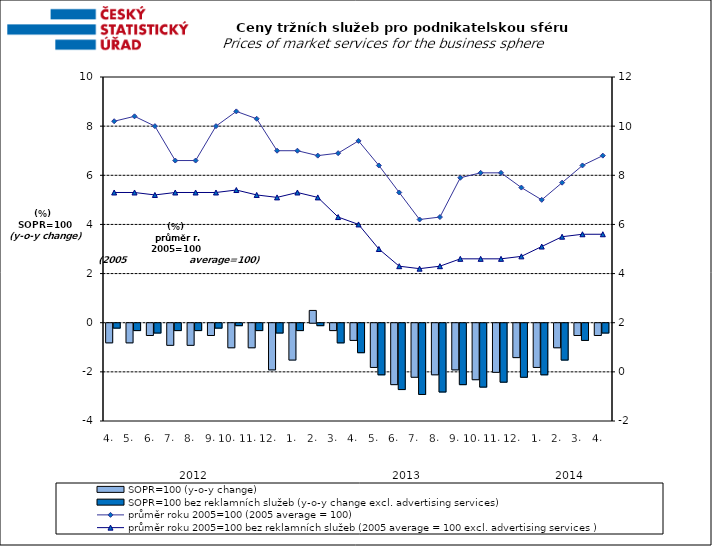
| Category | SOPR=100 (y-o-y change)   | SOPR=100 bez reklamních služeb (y-o-y change excl. advertising services)   |
|---|---|---|
| 0 | -0.8 | -0.2 |
| 1 | -0.8 | -0.3 |
| 2 | -0.5 | -0.4 |
| 3 | -0.9 | -0.3 |
| 4 | -0.9 | -0.3 |
| 5 | -0.5 | -0.2 |
| 6 | -1 | -0.1 |
| 7 | -1 | -0.3 |
| 8 | -1.9 | -0.4 |
| 9 | -1.5 | -0.3 |
| 10 | 0.5 | -0.1 |
| 11 | -0.3 | -0.8 |
| 12 | -0.7 | -1.2 |
| 13 | -1.8 | -2.1 |
| 14 | -2.5 | -2.7 |
| 15 | -2.2 | -2.9 |
| 16 | -2.1 | -2.8 |
| 17 | -1.9 | -2.5 |
| 18 | -2.3 | -2.6 |
| 19 | -2 | -2.4 |
| 20 | -1.4 | -2.2 |
| 21 | -1.8 | -2.1 |
| 22 | -1 | -1.5 |
| 23 | -0.5 | -0.7 |
| 24 | -0.5 | -0.4 |